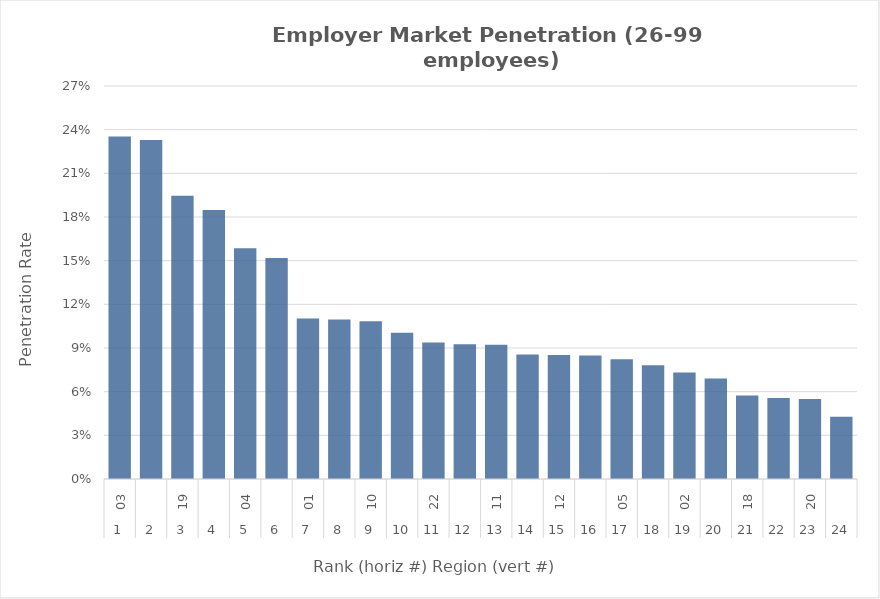
| Category | Rate |
|---|---|
| 0 | 0.235 |
| 1 | 0.233 |
| 2 | 0.195 |
| 3 | 0.185 |
| 4 | 0.158 |
| 5 | 0.152 |
| 6 | 0.11 |
| 7 | 0.11 |
| 8 | 0.108 |
| 9 | 0.101 |
| 10 | 0.094 |
| 11 | 0.093 |
| 12 | 0.092 |
| 13 | 0.086 |
| 14 | 0.085 |
| 15 | 0.085 |
| 16 | 0.082 |
| 17 | 0.078 |
| 18 | 0.073 |
| 19 | 0.069 |
| 20 | 0.057 |
| 21 | 0.056 |
| 22 | 0.055 |
| 23 | 0.043 |